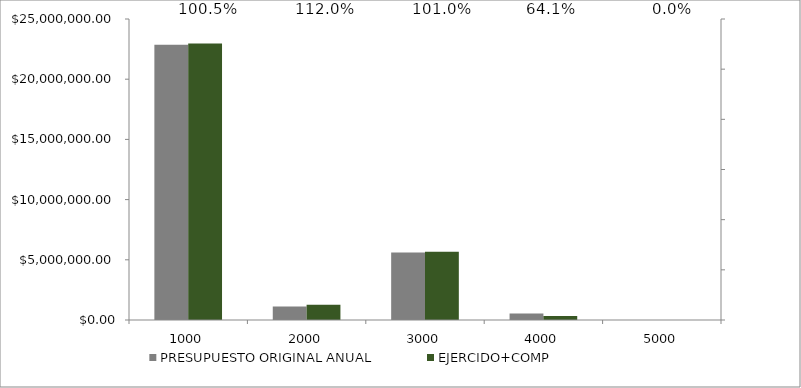
| Category | PRESUPUESTO ORIGINAL ANUAL | EJERCIDO+COMP |
|---|---|---|
| 1000.0 | 22862456 | 22975493.38 |
| 2000.0 | 1128884 | 1263853.56 |
| 3000.0 | 5604895 | 5660427.36 |
| 4000.0 | 530650 | 340148.08 |
| 5000.0 | 0 | 0 |